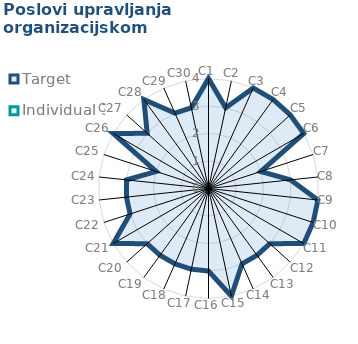
| Category | Target | Individual 3 |
|---|---|---|
| C1 | 4 | 0 |
| C2 | 3 | 0 |
| C3 | 4 | 0 |
| C4 | 4 | 0 |
| C5 | 4 | 0 |
| C6 | 4 | 0 |
| C7 | 2 | 0 |
| C8 | 3 | 0 |
| C9 | 4 | 0 |
| C10 | 4 | 0 |
| C11 | 4 | 0 |
| C12 | 3 | 0 |
| C13 | 3 | 0 |
| C14 | 3 | 0 |
| C15 | 4 | 0 |
| C16 | 3 | 0 |
| C17 | 3 | 0 |
| C18 | 3 | 0 |
| C19 | 3 | 0 |
| C20 | 3 | 0 |
| C21 | 4 | 0 |
| C22 | 3 | 0 |
| C23 | 3 | 0 |
| C24 | 3 | 0 |
| C25 | 2 | 0 |
| C26 | 4 | 0 |
| C27 | 3 | 0 |
| C28 | 4 | 0 |
| C29 | 3 | 0 |
| C30 | 3 | 0 |